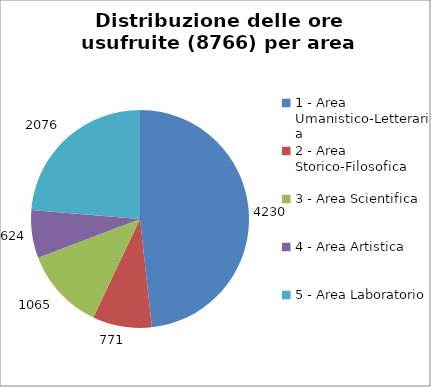
| Category | Nr. Ore Usufruite |
|---|---|
| 1 - Area Umanistico-Letteraria | 4230 |
| 2 - Area Storico-Filosofica | 771 |
| 3 - Area Scientifica | 1065 |
| 4 - Area Artistica | 624 |
| 5 - Area Laboratorio | 2076 |